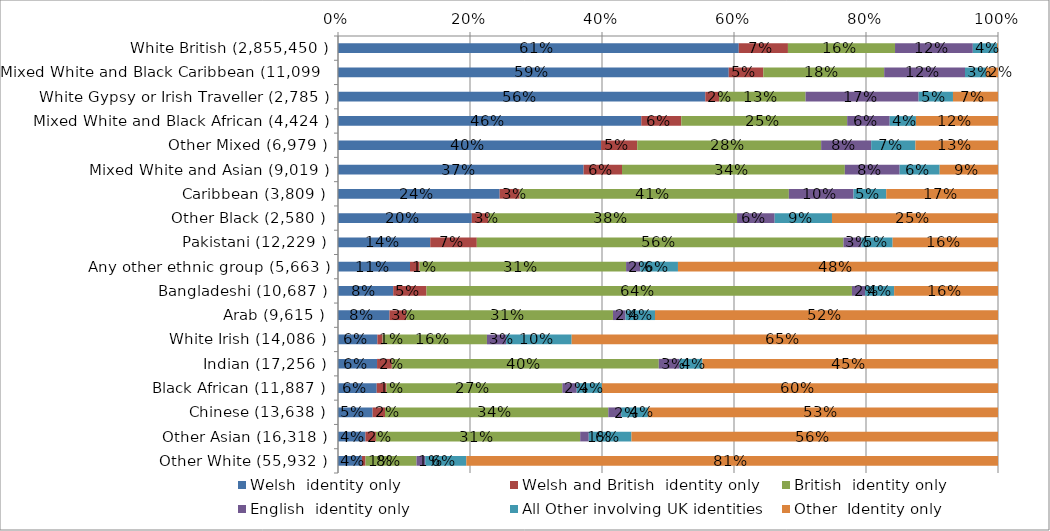
| Category | Welsh  identity only | Welsh and British  identity only | British  identity only | English  identity only | All Other involving UK identities  | Other  Identity only |
|---|---|---|---|---|---|---|
| White British (2,855,450 ) | 0.607 | 0.074 | 0.162 | 0.118 | 0.037 | 0.001 |
| Mixed White and Black Caribbean (11,099 ) | 0.592 | 0.052 | 0.183 | 0.122 | 0.032 | 0.018 |
| White Gypsy or Irish Traveller (2,785 ) | 0.557 | 0.021 | 0.131 | 0.171 | 0.052 | 0.068 |
| Mixed White and Black African (4,424 ) | 0.46 | 0.061 | 0.251 | 0.064 | 0.04 | 0.124 |
|  Other Mixed (6,979 ) | 0.399 | 0.055 | 0.279 | 0.076 | 0.067 | 0.125 |
| Mixed White and Asian (9,019 ) | 0.372 | 0.058 | 0.338 | 0.083 | 0.061 | 0.088 |
| Caribbean (3,809 ) | 0.245 | 0.03 | 0.408 | 0.098 | 0.05 | 0.169 |
| Other Black (2,580 ) | 0.203 | 0.025 | 0.377 | 0.057 | 0.087 | 0.252 |
| Pakistani (12,229 ) | 0.14 | 0.071 | 0.555 | 0.027 | 0.047 | 0.16 |
| Any other ethnic group (5,663 ) | 0.109 | 0.014 | 0.313 | 0.021 | 0.057 | 0.485 |
| Bangladeshi (10,687 ) | 0.084 | 0.05 | 0.645 | 0.02 | 0.044 | 0.157 |
| Arab (9,615 ) | 0.078 | 0.026 | 0.313 | 0.019 | 0.045 | 0.52 |
| White Irish (14,086 ) | 0.06 | 0.008 | 0.158 | 0.029 | 0.099 | 0.646 |
| Indian (17,256 ) | 0.059 | 0.022 | 0.404 | 0.031 | 0.035 | 0.448 |
| Black African (11,887 ) | 0.059 | 0.015 | 0.267 | 0.022 | 0.038 | 0.6 |
| Chinese (13,638 ) | 0.052 | 0.019 | 0.338 | 0.019 | 0.041 | 0.53 |
| Other Asian (16,318 ) | 0.042 | 0.016 | 0.31 | 0.013 | 0.065 | 0.555 |
| Other White (55,932 ) | 0.036 | 0.005 | 0.077 | 0.013 | 0.062 | 0.806 |